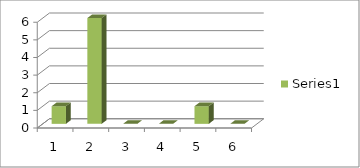
| Category | Series 0 |
|---|---|
| 0 | 1 |
| 1 | 6 |
| 2 | 0 |
| 3 | 0 |
| 4 | 1 |
| 5 | 0 |